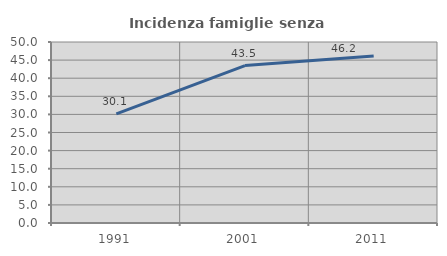
| Category | Incidenza famiglie senza nuclei |
|---|---|
| 1991.0 | 30.137 |
| 2001.0 | 43.478 |
| 2011.0 | 46.154 |